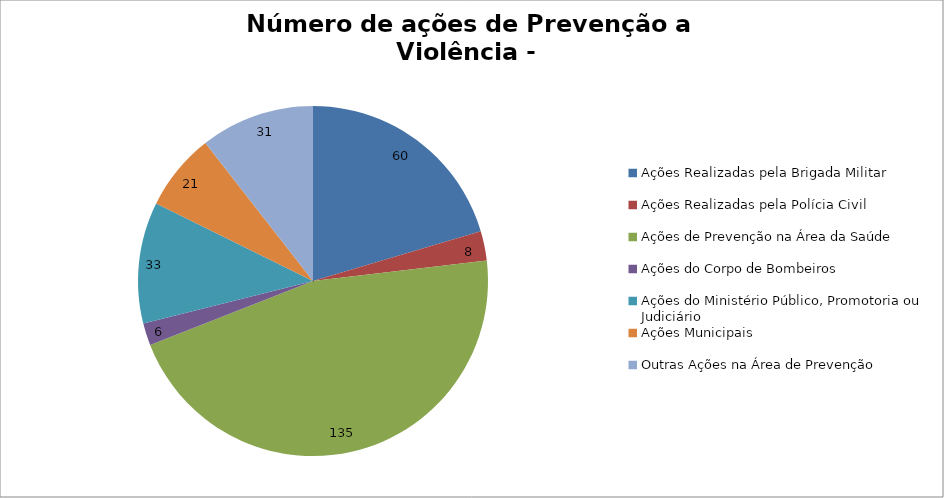
| Category | Número de Ações |
|---|---|
| Ações Realizadas pela Brigada Militar | 60 |
| Ações Realizadas pela Polícia Civil | 8 |
| Ações de Prevenção na Área da Saúde | 135 |
| Ações do Corpo de Bombeiros | 6 |
| Ações do Ministério Público, Promotoria ou Judiciário | 33 |
| Ações Municipais | 21 |
| Outras Ações na Área de Prevenção | 31 |